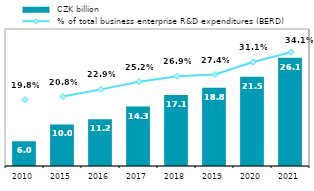
| Category |  CZK billion |
|---|---|
| 2010.0 | 5.956 |
| 2015.0 | 10 |
| 2016.0 | 11.234 |
| 2017.0 | 14.33 |
| 2018.0 | 17.101 |
| 2019.0 | 18.83 |
| 2020.0 | 21.517 |
| 2021.0 | 26.096 |